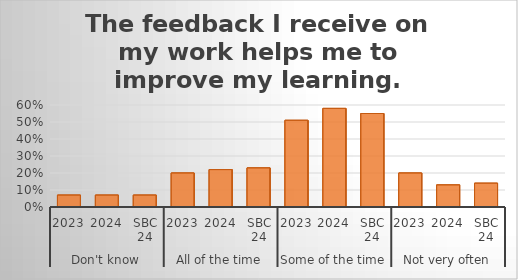
| Category | The feedback I receive on my work helps me to improve my learning. |
|---|---|
| 0 | 0.07 |
| 1 | 0.07 |
| 2 | 0.07 |
| 3 | 0.2 |
| 4 | 0.22 |
| 5 | 0.23 |
| 6 | 0.51 |
| 7 | 0.58 |
| 8 | 0.55 |
| 9 | 0.2 |
| 10 | 0.13 |
| 11 | 0.14 |